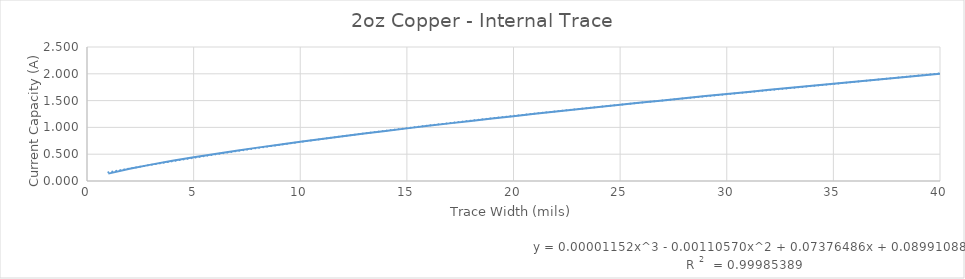
| Category | Series 0 |
|---|---|
| 0 | 0.138 |
| 1 | 0.228 |
| 2 | 0.306 |
| 3 | 0.377 |
| 4 | 0.443 |
| 5 | 0.505 |
| 6 | 0.565 |
| 7 | 0.623 |
| 8 | 0.678 |
| 9 | 0.732 |
| 10 | 0.784 |
| 11 | 0.835 |
| 12 | 0.885 |
| 13 | 0.934 |
| 14 | 0.982 |
| 15 | 1.029 |
| 16 | 1.075 |
| 17 | 1.121 |
| 18 | 1.165 |
| 19 | 1.21 |
| 20 | 1.253 |
| 21 | 1.296 |
| 22 | 1.339 |
| 23 | 1.381 |
| 24 | 1.422 |
| 25 | 1.463 |
| 26 | 1.504 |
| 27 | 1.544 |
| 28 | 1.584 |
| 29 | 1.623 |
| 30 | 1.662 |
| 31 | 1.701 |
| 32 | 1.739 |
| 33 | 1.777 |
| 34 | 1.815 |
| 35 | 1.852 |
| 36 | 1.89 |
| 37 | 1.926 |
| 38 | 1.963 |
| 39 | 1.999 |